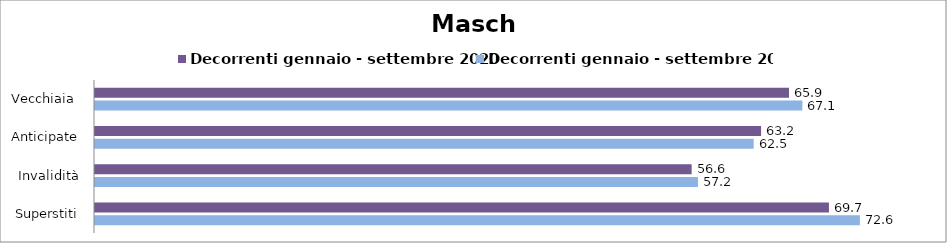
| Category | Decorrenti gennaio - settembre 2020 | Decorrenti gennaio - settembre 2021 |
|---|---|---|
| Vecchiaia  | 65.86 | 67.13 |
| Anticipate | 63.21 | 62.51 |
| Invalidità | 56.62 | 57.22 |
| Superstiti | 69.65 | 72.59 |